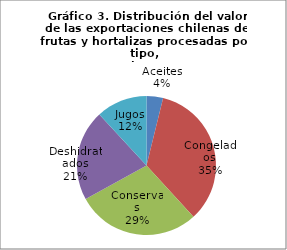
| Category | Series 0 |
|---|---|
| Aceites | 27214758.66 |
| Congelados | 242733594.67 |
| Conservas | 203298761.44 |
| Deshidratados | 149596720.35 |
| Jugos | 83858050.85 |